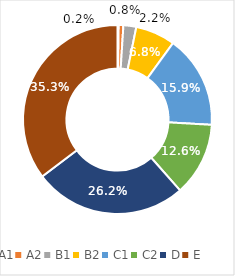
| Category | Perú |
|---|---|
| A1 | 0.002 |
| A2 | 0.008 |
| B1 | 0.022 |
| B2 | 0.068 |
| C1 | 0.159 |
| C2 | 0.126 |
| D | 0.262 |
| E | 0.353 |